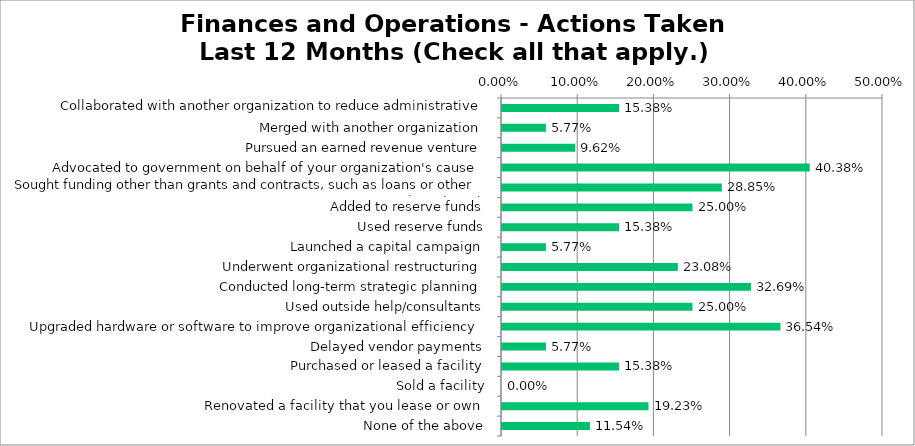
| Category | Responses |
|---|---|
| Collaborated with another organization to reduce administrative expenses | 0.154 |
| Merged with another organization | 0.058 |
| Pursued an earned revenue venture | 0.096 |
| Advocated to government on behalf of your organization's cause | 0.404 |
| Sought funding other than grants and contracts, such as loans or other investments | 0.288 |
| Added to reserve funds | 0.25 |
| Used reserve funds | 0.154 |
| Launched a capital campaign | 0.058 |
| Underwent organizational restructuring | 0.231 |
| Conducted long-term strategic planning | 0.327 |
| Used outside help/consultants | 0.25 |
| Upgraded hardware or software to improve organizational efficiency | 0.365 |
| Delayed vendor payments | 0.058 |
| Purchased or leased a facility | 0.154 |
| Sold a facility | 0 |
| Renovated a facility that you lease or own | 0.192 |
| None of the above | 0.115 |